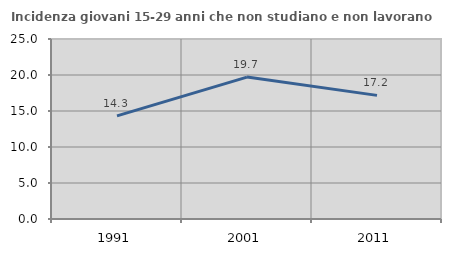
| Category | Incidenza giovani 15-29 anni che non studiano e non lavorano  |
|---|---|
| 1991.0 | 14.317 |
| 2001.0 | 19.71 |
| 2011.0 | 17.172 |